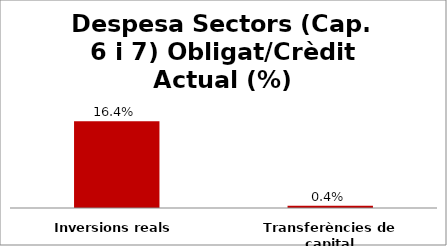
| Category | Series 0 |
|---|---|
| Inversions reals | 0.164 |
| Transferències de capital | 0.004 |